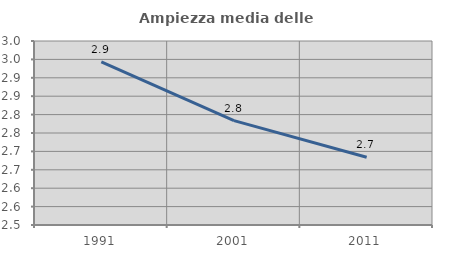
| Category | Ampiezza media delle famiglie |
|---|---|
| 1991.0 | 2.943 |
| 2001.0 | 2.784 |
| 2011.0 | 2.684 |